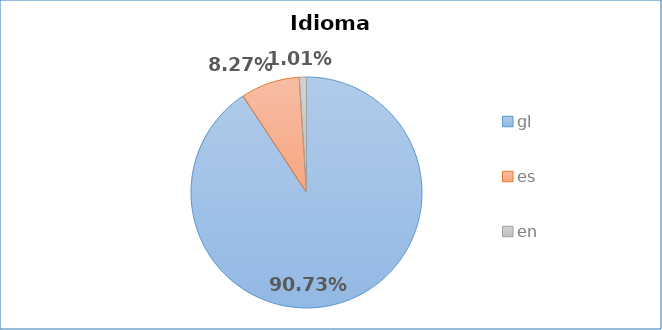
| Category | Idioma empregado |
|---|---|
| gl | 0.907 |
| es | 0.083 |
| en | 0.01 |